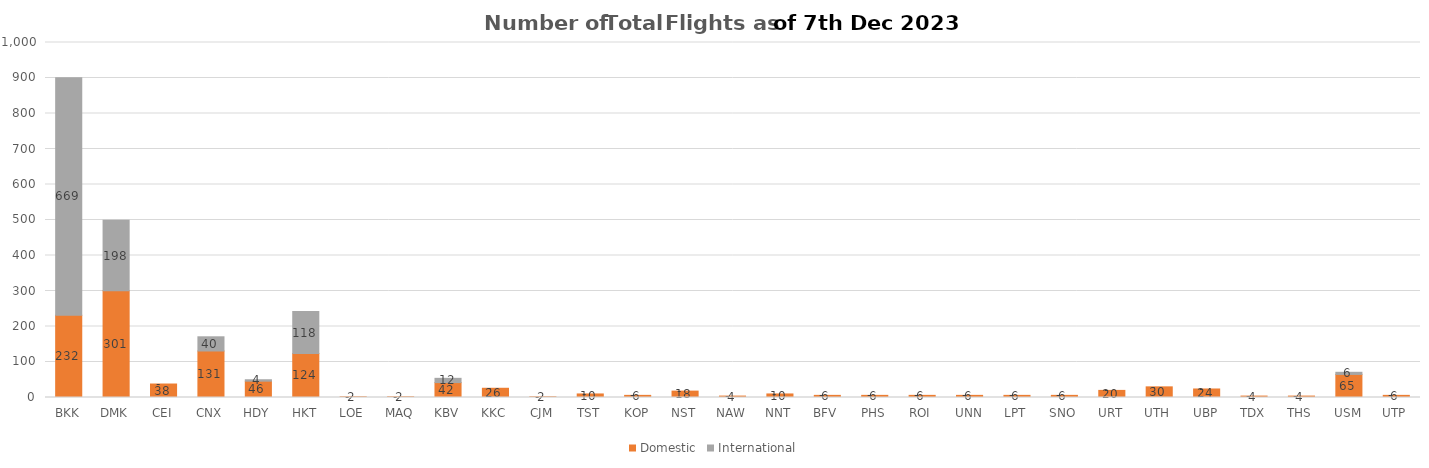
| Category | Domestic | International |
|---|---|---|
| BKK | 232 | 669 |
| DMK | 301 | 198 |
| CEI | 38 | 0 |
| CNX | 131 | 40 |
| HDY | 46 | 4 |
| HKT | 124 | 118 |
| LOE | 2 | 0 |
| MAQ | 2 | 0 |
| KBV | 42 | 12 |
| KKC | 26 | 0 |
| CJM | 2 | 0 |
| TST | 10 | 0 |
| KOP | 6 | 0 |
| NST | 18 | 0 |
| NAW | 4 | 0 |
| NNT | 10 | 0 |
| BFV | 6 | 0 |
| PHS | 6 | 0 |
| ROI | 6 | 0 |
| UNN | 6 | 0 |
| LPT | 6 | 0 |
| SNO | 6 | 0 |
| URT | 20 | 0 |
| UTH | 30 | 0 |
| UBP | 24 | 0 |
| TDX | 4 | 0 |
| THS | 4 | 0 |
| USM | 65 | 6 |
| UTP | 6 | 0 |